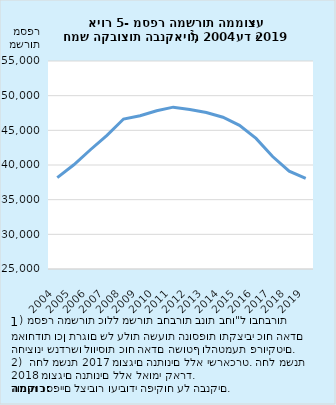
| Category | מספר המשרות הממוצע3 |
|---|---|
| 2004.0 | 38170 |
| 2005.0 | 40029 |
| 2006.0 | 42200 |
| 2007.0 | 44286 |
| 2008.0 | 46628 |
| 2009.0 | 47097 |
| 2010.0 | 47818 |
| 2011.0 | 48344 |
| 2012.0 | 48010 |
| 2013.0 | 47577 |
| 2014.0 | 46889 |
| 2015.0 | 45714 |
| 2016.0 | 43833 |
| 2017.0 | 41219 |
| 2018.0 | 39101 |
| 2019.0 | 38062 |